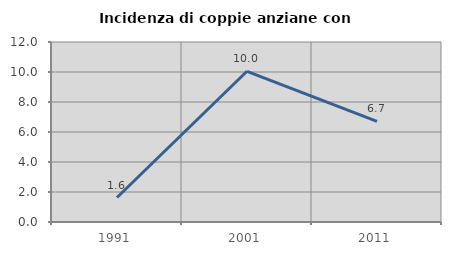
| Category | Incidenza di coppie anziane con figli |
|---|---|
| 1991.0 | 1.633 |
| 2001.0 | 10.048 |
| 2011.0 | 6.704 |